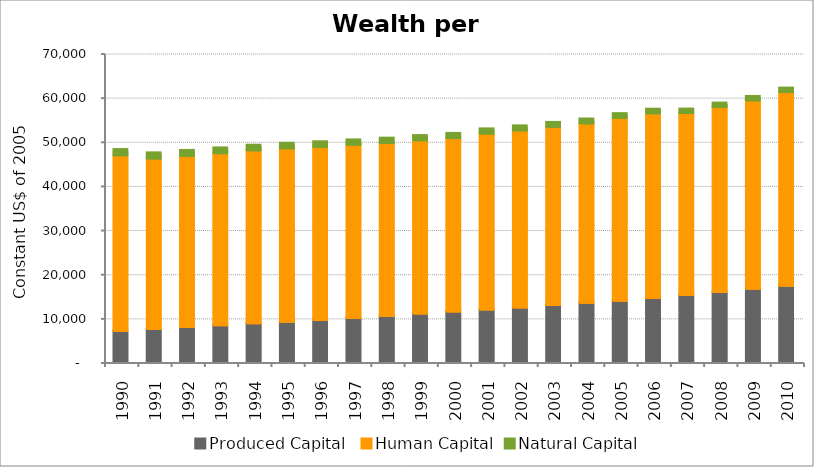
| Category | Produced Capital  | Human Capital | Natural Capital |
|---|---|---|---|
| 1990.0 | 7091.914 | 39751.904 | 1283.729 |
| 1991.0 | 7499.942 | 38614.781 | 1257.317 |
| 1992.0 | 7904.436 | 38791.772 | 1229.325 |
| 1993.0 | 8307.679 | 38996.173 | 1191.263 |
| 1994.0 | 8784.358 | 39170.57 | 1154.683 |
| 1995.0 | 9100.504 | 39319.291 | 1129.933 |
| 1996.0 | 9504.583 | 39267.038 | 1107.471 |
| 1997.0 | 9981.11 | 39238.472 | 1086.842 |
| 1998.0 | 10396.285 | 39234.047 | 1076.61 |
| 1999.0 | 10990.986 | 39253.014 | 1048.418 |
| 2000.0 | 11451.428 | 39280.584 | 1047.309 |
| 2001.0 | 11920.409 | 39844.188 | 1042.544 |
| 2002.0 | 12351.372 | 40125.343 | 1011.062 |
| 2003.0 | 12887.64 | 40393.657 | 988.956 |
| 2004.0 | 13403.296 | 40676.708 | 967.752 |
| 2005.0 | 13862.828 | 41455.603 | 939.139 |
| 2006.0 | 14496.733 | 41853.734 | 914.617 |
| 2007.0 | 15178.586 | 41224.584 | 891.158 |
| 2008.0 | 15846.796 | 41922.872 | 876.936 |
| 2009.0 | 16602.767 | 42684.04 | 871.529 |
| 2010.0 | 17290.52 | 43885.505 | 866.318 |